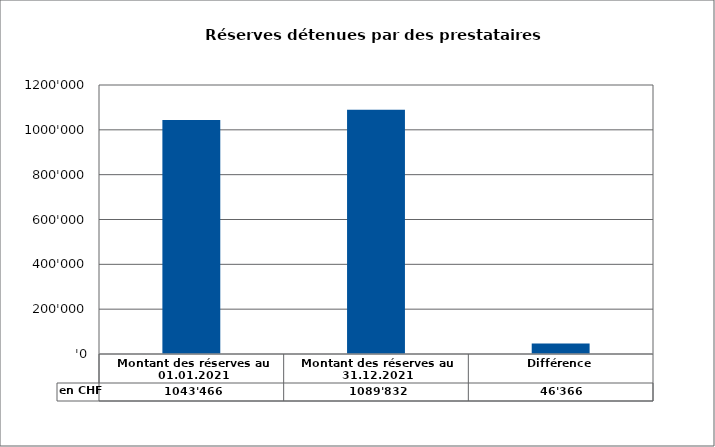
| Category | en CHF |
|---|---|
| Montant des réserves au 01.01.2021 | 1043466 |
| Montant des réserves au 31.12.2021 | 1089832 |
| Différence | 46366 |